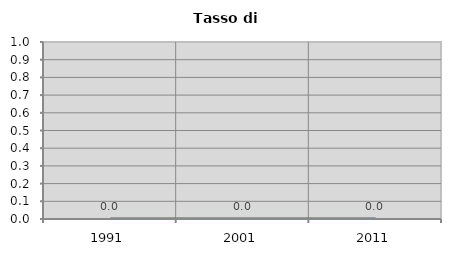
| Category | Tasso di disoccupazione   |
|---|---|
| 1991.0 | 0 |
| 2001.0 | 0 |
| 2011.0 | 0 |